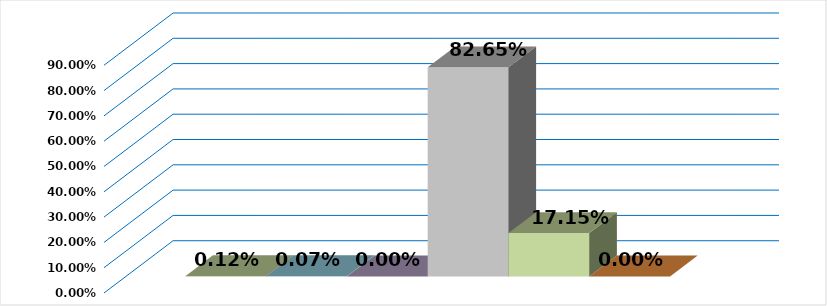
| Category | Series 0 | Series 1 | Series 2 | Series 3 | Series 4 | Series 5 |
|---|---|---|---|---|---|---|
| 0 | 0.001 | 0.001 | 0 | 0.827 | 0.172 | 0 |